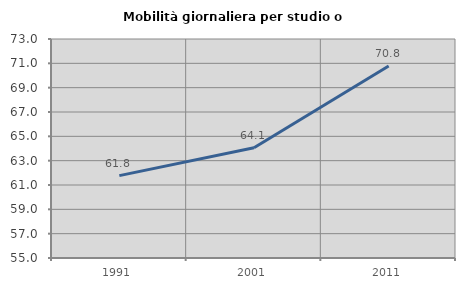
| Category | Mobilità giornaliera per studio o lavoro |
|---|---|
| 1991.0 | 61.771 |
| 2001.0 | 64.059 |
| 2011.0 | 70.785 |